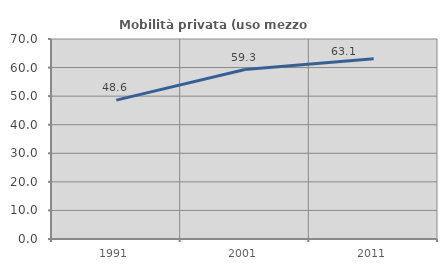
| Category | Mobilità privata (uso mezzo privato) |
|---|---|
| 1991.0 | 48.596 |
| 2001.0 | 59.307 |
| 2011.0 | 63.126 |